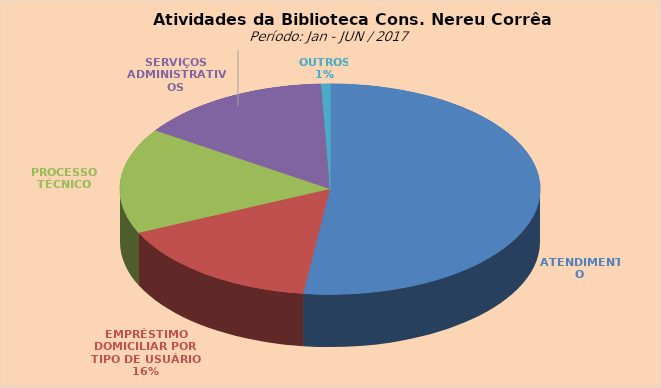
| Category | Series 0 |
|---|---|
| ATENDIMENTO | 6926 |
| EMPRÉSTIMO DOMICILIAR POR TIPO DE USUÁRIO | 2153 |
| PROCESSO TÉCNICO | 2158 |
| SERVIÇOS ADMINISTRATIVOS | 1986 |
| OUTROS | 91 |